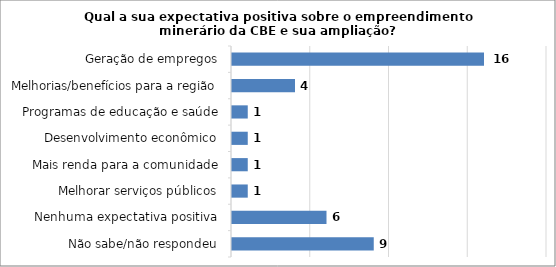
| Category | Series 0 |
|---|---|
| Não sabe/não respondeu | 9 |
| Nenhuma expectativa positiva | 6 |
| Melhorar serviços públicos | 1 |
| Mais renda para a comunidade | 1 |
| Desenvolvimento econômico | 1 |
| Programas de educação e saúde | 1 |
| Melhorias/benefícios para a região | 4 |
| Geração de empregos | 16 |